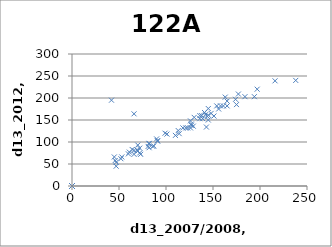
| Category | Series 0 |
|---|---|
| 99.0 | 120 |
| 165.0 | 193 |
| 66.0 | 72 |
| 0.0 | 0 |
| 87.0 | 91 |
| 177.0 | 209 |
| 154.0 | 182 |
| 66.0 | 164 |
| 143.0 | 134 |
| 0.0 | 0 |
| 118.0 | 132 |
| 42.0 | 195 |
| 129.0 | 136 |
| 127.0 | 141 |
| 123.0 | 132 |
| 101.0 | 118 |
| 158.0 | 182 |
| 194.0 | 203 |
| 114.0 | 119 |
| 145.0 | 150 |
| 144.0 | 158 |
| 126.0 | 132 |
| 130.0 | 156 |
| 113.0 | 126 |
| 82.0 | 97 |
| 136.0 | 160 |
| 175.0 | 185 |
| 110.0 | 115 |
| 161.0 | 182 |
| 156.0 | 175 |
| 138.0 | 160 |
| 184.0 | 203 |
| 91.0 | 102 |
| 70.0 | 80 |
| 163.0 | 202 |
| 145.0 | 176 |
| 82.0 | 96 |
| 216.0 | 239 |
| 91.0 | 103 |
| 145.0 | 161 |
| 165.0 | 182 |
| 151.0 | 159 |
| 197.0 | 220 |
| 238.0 | 240 |
| 121.0 | 132 |
| 174.0 | 197 |
| 0.0 | 0 |
| 136.0 | 153 |
| 70.0 | 80 |
| 141.0 | 167 |
| 73.0 | 72 |
| 64.0 | 83 |
| 0.0 | 0 |
| 90.0 | 107 |
| 47.0 | 45 |
| 0.0 | 0 |
| 52.0 | 62 |
| 81.0 | 90 |
| 66.0 | 81 |
| 53.0 | 66 |
| 148.0 | 165 |
| 126.0 | 148 |
| 60.0 | 73 |
| 46.0 | 58 |
| 142.0 | 162 |
| 72.0 | 75 |
| 82.0 | 87 |
| 0.0 | 0 |
| 45.0 | 66 |
| 0.0 | 0 |
| 0.0 | 0 |
| 0.0 | 0 |
| 0.0 | 0 |
| 139.0 | 153 |
| 0.0 | 0 |
| 70.0 | 93 |
| 127.0 | 138 |
| 47.0 | 54 |
| 72.0 | 86 |
| 69.0 | 82 |
| 61.0 | 77 |
| 86.0 | 90 |
| 0.0 | 0 |
| 0.0 | 0 |
| 0.0 | 0 |
| 0.0 | 0 |
| 0.0 | 0 |
| 0.0 | 0 |